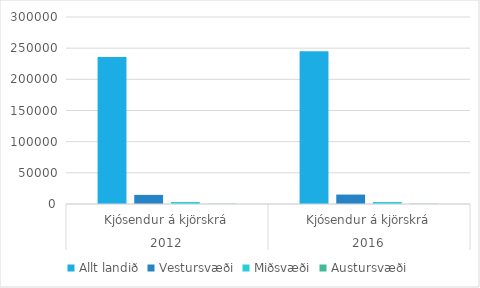
| Category | Allt landið | Vestursvæði | Miðsvæði | Austursvæði |
|---|---|---|---|---|
| 0 | 235743 | 14609 | 3223 | 402 |
| 1 | 244896 | 15141 | 3194 | 406 |